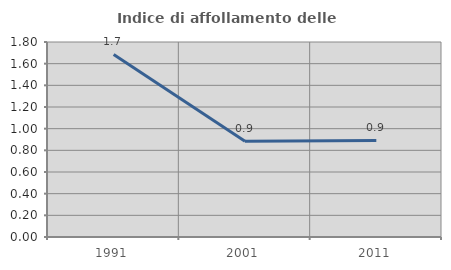
| Category | Indice di affollamento delle abitazioni  |
|---|---|
| 1991.0 | 1.685 |
| 2001.0 | 0.884 |
| 2011.0 | 0.891 |